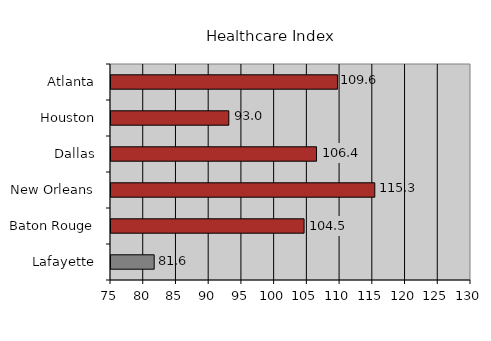
| Category | 81.6 |
|---|---|
| Lafayette | 81.6 |
| Baton Rouge | 104.5 |
| New Orleans | 115.3 |
| Dallas | 106.4 |
| Houston | 93 |
| Atlanta | 109.6 |